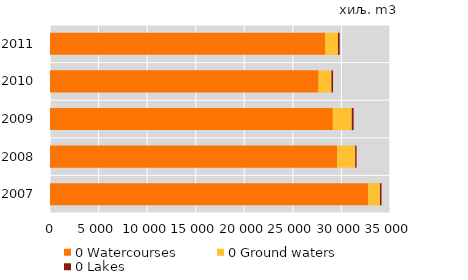
| Category | 0 Watercourses | 0 Ground waters | 0 Lakes |
|---|---|---|---|
| 2007.0 | 32765 | 1204 | 159 |
| 2008.0 | 29567 | 1852 | 142 |
| 2009.0 | 29115 | 1950 | 191 |
| 2010.0 | 27648 | 1321 | 170 |
| 2011.0 | 28338 | 1306 | 175 |